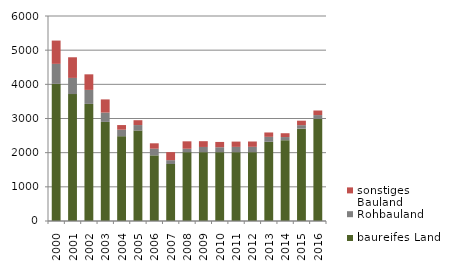
| Category | baureifes Land | Rohbauland | sonstiges Bauland |
|---|---|---|---|
| 2000.0 | 4013 | 586 | 682 |
| 2001.0 | 3715 | 473 | 604 |
| 2002.0 | 3427 | 410 | 456 |
| 2003.0 | 2900 | 273 | 386 |
| 2004.0 | 2482 | 191 | 135 |
| 2005.0 | 2646 | 162 | 142 |
| 2006.0 | 1921 | 195 | 158 |
| 2007.0 | 1669 | 111 | 236 |
| 2008.0 | 2014 | 101 | 217 |
| 2009.0 | 2014 | 153 | 169 |
| 2010.0 | 2014 | 145 | 155 |
| 2011.0 | 2014 | 155 | 155 |
| 2012.0 | 2014 | 157 | 156 |
| 2013.0 | 2319 | 144 | 128 |
| 2014.0 | 2364 | 93 | 112 |
| 2015.0 | 2703 | 102 | 131 |
| 2016.0 | 2989 | 111 | 134 |